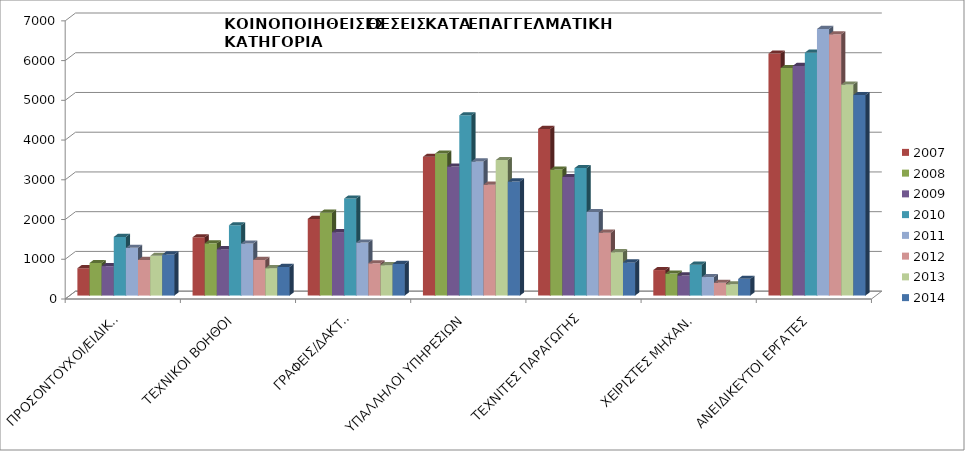
| Category | 2007 | 2008 | 2009 | 2010 | 2011 | 2012 | 2013 | 2014 |
|---|---|---|---|---|---|---|---|---|
| ΠΡΟΣΟΝΤΟΥΧΟΙ/ΕΙΔΙΚΟΙ | 688 | 819 | 741 | 1476 | 1201 | 896 | 999 | 1034 |
| ΤΕΧΝΙΚΟΙ ΒΟΗΘΟΙ | 1467 | 1315 | 1167 | 1769 | 1310 | 895 | 690 | 721 |
| ΓΡΑΦΕΙΣ/ΔΑΚΤ.Ι | 1929 | 2084 | 1596 | 2442 | 1335 | 812 | 765 | 795 |
| ΥΠΑΛΛΗΛΟΙ ΥΠΗΡΕΣΙΩΝ | 3492 | 3573 | 3246 | 4536 | 3374 | 2791 | 3410 | 2871 |
| ΤΕΧΝΙΤΕΣ ΠΑΡΑΓΩΓΗΣ | 4193 | 3170 | 2981 | 3208 | 2101 | 1582 | 1092 | 835 |
| ΧΕΙΡΙΣΤΕΣ ΜΗΧΑΝ. | 642 | 553 | 505 | 778 | 466 | 321 | 284 | 421 |
| ΑΝΕΙΔΙΚΕΥΤΟΙ ΕΡΓΑΤΕΣ | 6090 | 5726 | 5780 | 6114 | 6709 | 6575 | 5311 | 5047 |